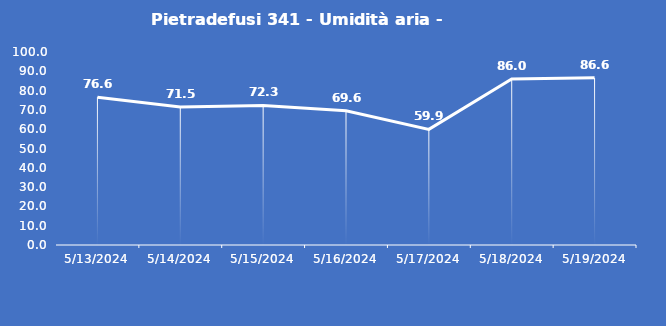
| Category | Pietradefusi 341 - Umidità aria - Grezzo (%) |
|---|---|
| 5/13/24 | 76.6 |
| 5/14/24 | 71.5 |
| 5/15/24 | 72.3 |
| 5/16/24 | 69.6 |
| 5/17/24 | 59.9 |
| 5/18/24 | 86 |
| 5/19/24 | 86.6 |